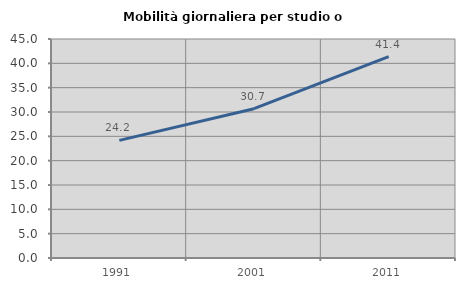
| Category | Mobilità giornaliera per studio o lavoro |
|---|---|
| 1991.0 | 24.176 |
| 2001.0 | 30.682 |
| 2011.0 | 41.379 |